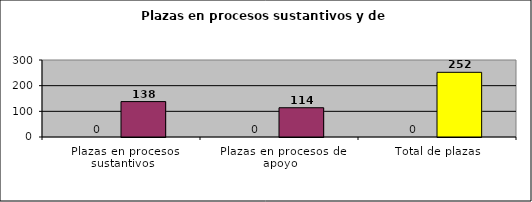
| Category | Series 0 | Series 1 |
|---|---|---|
| Plazas en procesos sustantivos |  | 138 |
| Plazas en procesos de apoyo |  | 114 |
| Total de plazas |  | 252 |